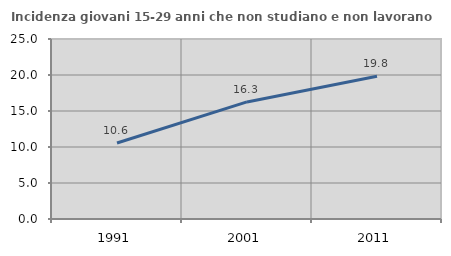
| Category | Incidenza giovani 15-29 anni che non studiano e non lavorano  |
|---|---|
| 1991.0 | 10.559 |
| 2001.0 | 16.258 |
| 2011.0 | 19.82 |